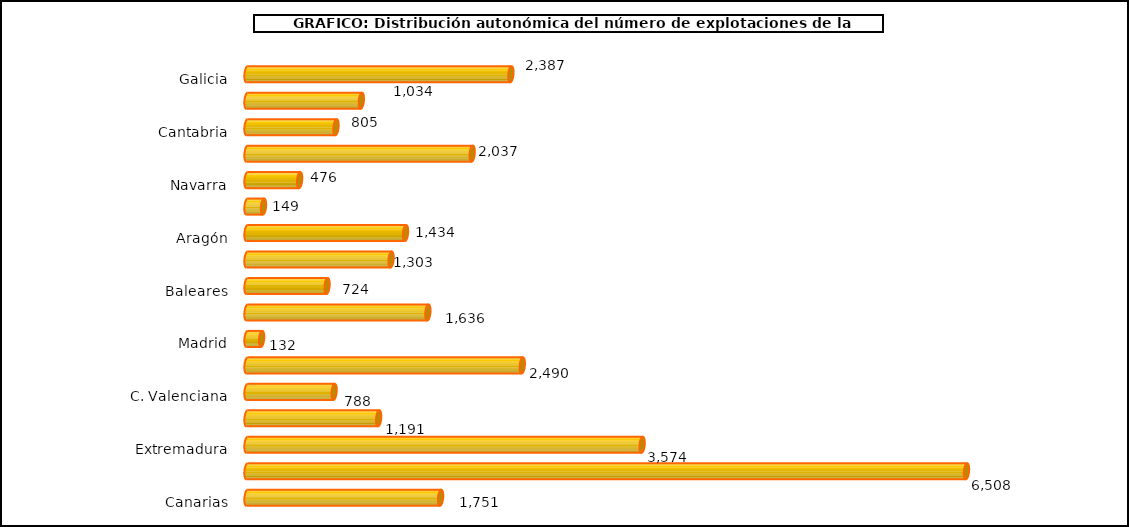
| Category | num. Explotaciones |
|---|---|
| 0 | 2387 |
| 1 | 1034 |
| 2 | 805 |
| 3 | 2037 |
| 4 | 476 |
| 5 | 149 |
| 6 | 1434 |
| 7 | 1303 |
| 8 | 724 |
| 9 | 1636 |
| 10 | 132 |
| 11 | 2490 |
| 12 | 788 |
| 13 | 1191 |
| 14 | 3574 |
| 15 | 6508 |
| 16 | 1751 |